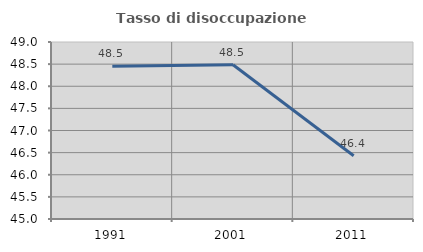
| Category | Tasso di disoccupazione giovanile  |
|---|---|
| 1991.0 | 48.454 |
| 2001.0 | 48.485 |
| 2011.0 | 46.429 |